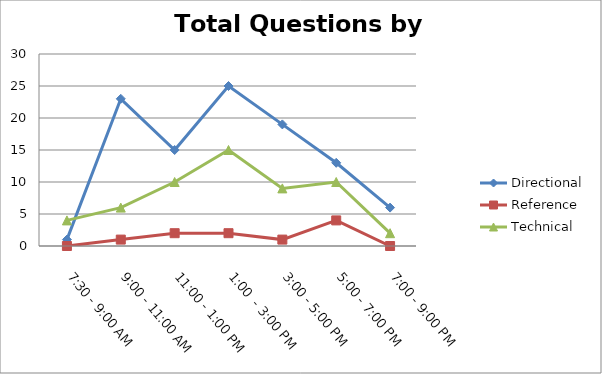
| Category | Directional | Reference | Technical |
|---|---|---|---|
| 7:30 - 9:00 AM | 1 | 0 | 4 |
| 9:00 - 11:00 AM | 23 | 1 | 6 |
| 11:00 - 1:00 PM | 15 | 2 | 10 |
| 1:00  - 3:00 PM | 25 | 2 | 15 |
| 3:00 - 5:00 PM | 19 | 1 | 9 |
| 5:00 - 7:00 PM | 13 | 4 | 10 |
| 7:00 - 9:00 PM | 6 | 0 | 2 |